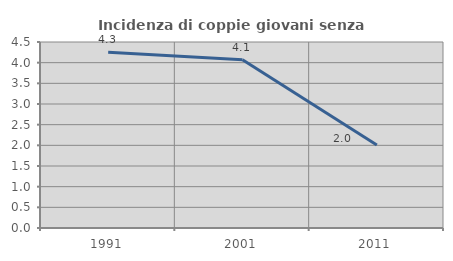
| Category | Incidenza di coppie giovani senza figli |
|---|---|
| 1991.0 | 4.251 |
| 2001.0 | 4.07 |
| 2011.0 | 2.006 |